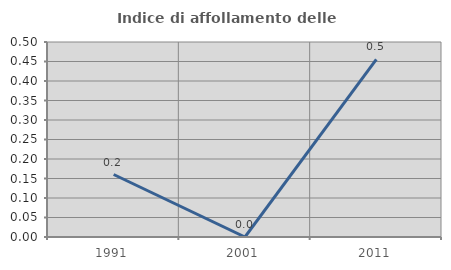
| Category | Indice di affollamento delle abitazioni  |
|---|---|
| 1991.0 | 0.16 |
| 2001.0 | 0 |
| 2011.0 | 0.455 |